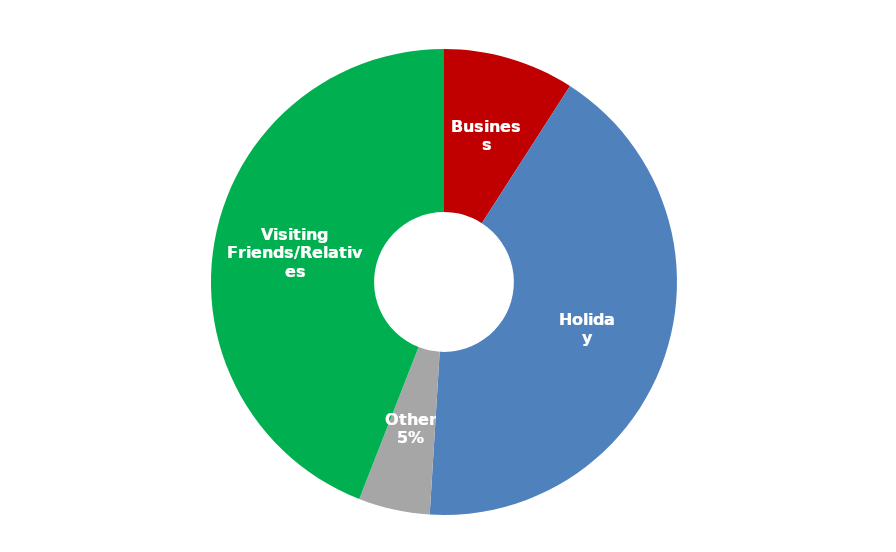
| Category | Oct 14-Sep 15 |
|---|---|
| Business | 411242.424 |
| Holiday | 1894306.27 |
| Other | 223716.768 |
| Visiting Friends/Relatives | 1993474.368 |